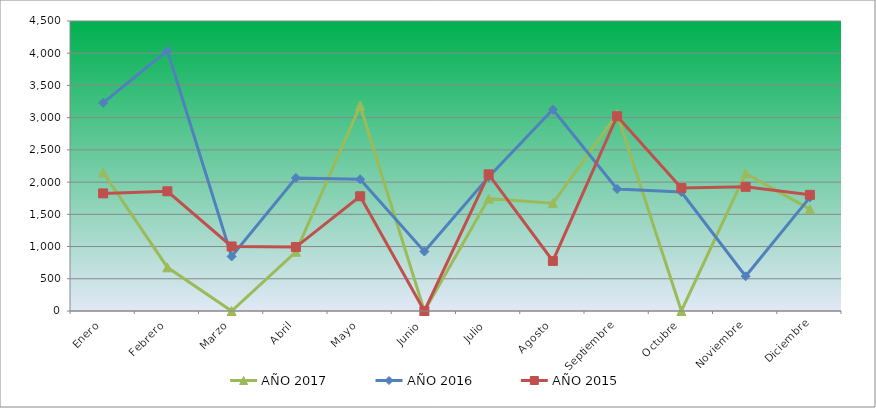
| Category | AÑO 2017 | AÑO 2016 | AÑO 2015 |
|---|---|---|---|
| Enero | 2151.448 | 3229.672 | 1824.906 |
| Febrero | 677.508 | 4039.515 | 1857.827 |
| Marzo | 0 | 846.71 | 1001.358 |
| Abril | 918.973 | 2064.45 | 992 |
| Mayo | 3184.815 | 2044.314 | 1780.453 |
| Junio | 0 | 922.819 | 0 |
| Julio | 1744.172 | 2080.269 | 2120.302 |
| Agosto | 1673.843 | 3125.704 | 776.755 |
| Septiembre | 3056.083 | 1893.205 | 3022.087 |
| Octubre | 0 | 1845.637 | 1909.132 |
| Noviembre | 2136.261 | 539.329 | 1926.935 |
| Diciembre | 1580.07 | 1762.393 | 1802.546 |